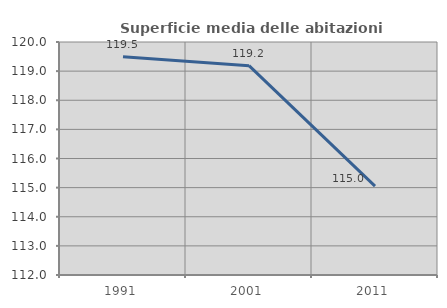
| Category | Superficie media delle abitazioni occupate |
|---|---|
| 1991.0 | 119.497 |
| 2001.0 | 119.187 |
| 2011.0 | 115.05 |